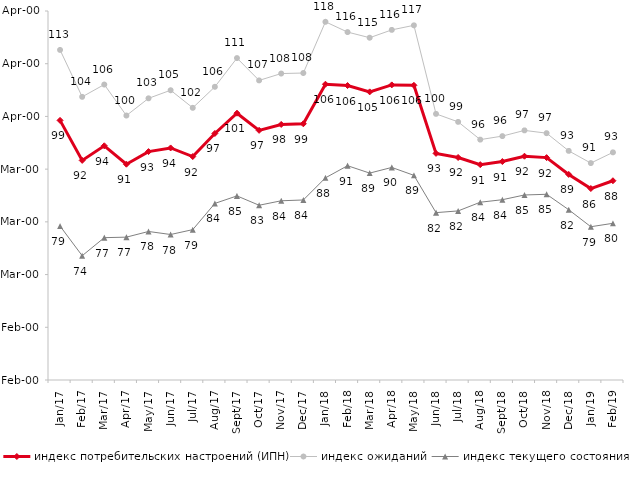
| Category | индекс потребительских настроений (ИПН) | Series 0 | индекс ожиданий | Series 3 | индекс текущего состояния |
|---|---|---|---|---|---|
| 2017-01-01 | 99.25 | 2017-01-01 | 112.617 | 2017-01-01 | 79.2 |
| 2017-02-01 | 91.66 | 2017-02-01 | 103.717 | 2017-02-01 | 73.575 |
| 2017-03-01 | 94.43 | 2017-03-01 | 106.05 | 2017-03-01 | 77 |
| 2017-04-01 | 90.94 | 2017-04-01 | 100.167 | 2017-04-01 | 77.1 |
| 2017-05-01 | 93.33 | 2017-05-01 | 103.433 | 2017-05-01 | 78.175 |
| 2017-06-01 | 94.02 | 2017-06-01 | 104.967 | 2017-06-01 | 77.6 |
| 2017-07-01 | 92.39 | 2017-07-01 | 101.633 | 2017-07-01 | 78.525 |
| 2017-08-01 | 96.77 | 2017-08-01 | 105.617 | 2017-08-01 | 83.5 |
| 2017-09-01 | 100.61 | 2017-09-01 | 111.067 | 2017-09-01 | 84.925 |
| 2017-10-01 | 97.36 | 2017-10-01 | 106.833 | 2017-10-01 | 83.15 |
| 2017-11-01 | 98.48 | 2017-11-01 | 108.133 | 2017-11-01 | 84 |
| 2017-12-01 | 98.6 | 2017-12-01 | 108.233 | 2017-12-01 | 84.15 |
| 2018-01-01 | 106.11 | 2018-01-01 | 117.95 | 2018-01-01 | 88.35 |
| 2018-02-01 | 105.86 | 2018-02-01 | 116 | 2018-02-01 | 90.65 |
| 2018-03-01 | 104.66 | 2018-03-01 | 114.933 | 2018-03-01 | 89.25 |
| 2018-04-01 | 105.98 | 2018-04-01 | 116.417 | 2018-04-01 | 90.325 |
| 2018-05-01 | 105.9 | 2018-05-01 | 117.283 | 2018-05-01 | 88.825 |
| 2018-06-01 | 92.99 | 2018-06-01 | 100.483 | 2018-06-01 | 81.75 |
| 2018-07-01 | 92.21 | 2018-07-01 | 98.967 | 2018-07-01 | 82.075 |
| 2018-08-01 | 90.85 | 2018-08-01 | 95.6 | 2018-08-01 | 83.725 |
| 2018-09-01 | 91.44 | 2018-09-01 | 96.267 | 2018-09-01 | 84.2 |
| 2018-10-01 | 92.45 | 2018-10-01 | 97.35 | 2018-10-01 | 85.1 |
| 2018-11-01 | 92.186 | 2018-11-01 | 96.823 | 2018-11-01 | 85.23 |
| 2018-12-01 | 89 | 2018-12-01 | 93.467 | 2018-12-01 | 82.3 |
| 2019-01-01 | 86.32 | 2019-01-01 | 91.15 | 2019-01-01 | 79.075 |
| 2019-02-01 | 87.8 | 2019-02-01 | 93.183 | 2019-02-01 | 79.725 |